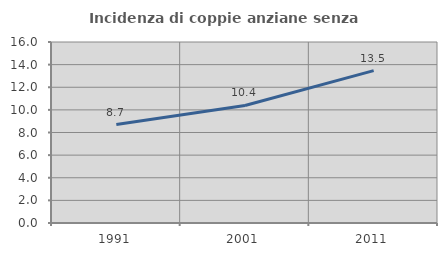
| Category | Incidenza di coppie anziane senza figli  |
|---|---|
| 1991.0 | 8.705 |
| 2001.0 | 10.391 |
| 2011.0 | 13.472 |